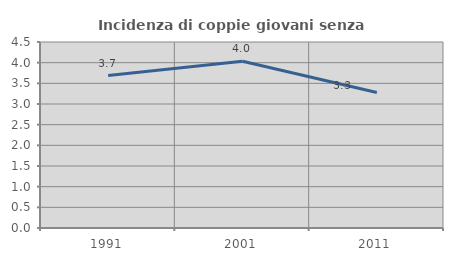
| Category | Incidenza di coppie giovani senza figli |
|---|---|
| 1991.0 | 3.689 |
| 2001.0 | 4.034 |
| 2011.0 | 3.279 |